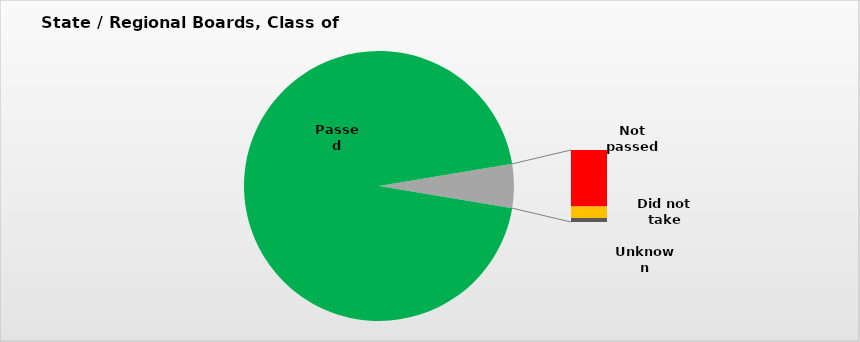
| Category | Series 0 |
|---|---|
| Passed | 0.948 |
| Not passed | 0.041 |
| Did not take | 0.008 |
| Unknown | 0.003 |